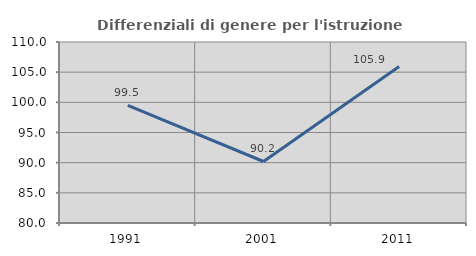
| Category | Differenziali di genere per l'istruzione superiore |
|---|---|
| 1991.0 | 99.479 |
| 2001.0 | 90.195 |
| 2011.0 | 105.932 |